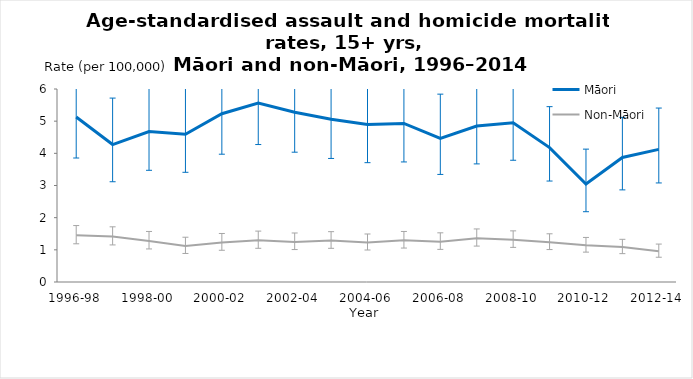
| Category | Māori | Non-Māori |
|---|---|---|
| 1996-98 | 5.131 | 1.451 |
| 1997-99 | 4.273 | 1.413 |
| 1998-00 | 4.679 | 1.278 |
| 1999-01 | 4.595 | 1.118 |
| 2000-02 | 5.232 | 1.227 |
| 2001-03 | 5.561 | 1.295 |
| 2002-04 | 5.276 | 1.246 |
| 2003-05 | 5.058 | 1.287 |
| 2004-06 | 4.898 | 1.225 |
| 2005-07 | 4.928 | 1.294 |
| 2006-08 | 4.465 | 1.252 |
| 2007-09 | 4.847 | 1.364 |
| 2008-10 | 4.948 | 1.314 |
| 2009-11 | 4.178 | 1.236 |
| 2010-12 | 3.045 | 1.14 |
| 2011-13 | 3.871 | 1.087 |
| 2012-14 | 4.123 | 0.958 |